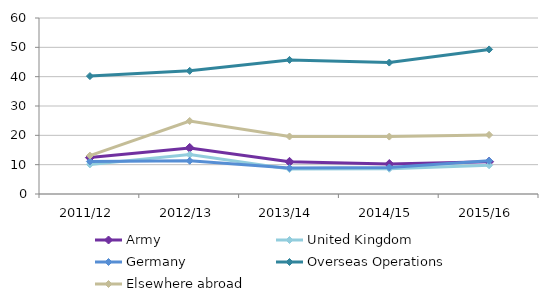
| Category | Army | United Kingdom | Germany | Overseas Operations | Elsewhere abroad |
|---|---|---|---|---|---|
| 2011/12 | 12.409 | 10.094 | 11.089 | 40.192 | 13.084 |
| 2012/13 | 15.714 | 13.424 | 11.319 | 41.979 | 24.896 |
| 2013/14 | 10.971 | 8.49 | 8.873 | 45.712 | 19.603 |
| 2014/15 | 10.214 | 8.604 | 9.034 | 44.803 | 19.573 |
| 2015/16 | 11.005 | 9.791 | 11.323 | 49.287 | 20.156 |